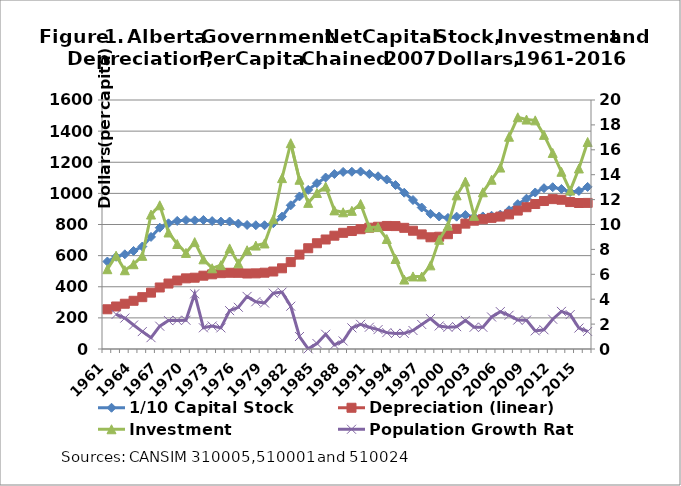
| Category | 1/10 Capital Stock | Depreciation (linear) | Investment |
|---|---|---|---|
| 1961.0 | 562.087 | 255.255 | 512.763 |
| 1962.0 | 592.476 | 273.192 | 599.708 |
| 1963.0 | 608.482 | 290.805 | 506.058 |
| 1964.0 | 630 | 309.79 | 544.755 |
| 1965.0 | 658.345 | 333.103 | 598.621 |
| 1966.0 | 720.202 | 362.22 | 863.86 |
| 1967.0 | 779.329 | 395.302 | 923.49 |
| 1968.0 | 807.546 | 420.604 | 748.688 |
| 1969.0 | 822.899 | 440.026 | 674.792 |
| 1970.0 | 828.527 | 453.918 | 617.555 |
| 1971.0 | 826.311 | 458.061 | 686.791 |
| 1972.0 | 828.941 | 471.049 | 576.121 |
| 1973.0 | 821.931 | 479.909 | 518.742 |
| 1974.0 | 818.524 | 487.285 | 538.578 |
| 1975.0 | 819.102 | 489.858 | 646.324 |
| 1976.0 | 805.548 | 489.491 | 550.477 |
| 1977.0 | 796.812 | 485.047 | 634.411 |
| 1978.0 | 795.306 | 486.094 | 664.609 |
| 1979.0 | 795.149 | 490.232 | 678.123 |
| 1980.0 | 807.977 | 497.94 | 833.855 |
| 1981.0 | 850.507 | 518.527 | 1098.161 |
| 1982.0 | 923.401 | 558.269 | 1322.459 |
| 1983.0 | 980.203 | 606.621 | 1087.489 |
| 1984.0 | 1022.471 | 647.477 | 939.051 |
| 1985.0 | 1065.34 | 679.562 | 1002.707 |
| 1986.0 | 1101.881 | 703.678 | 1043.598 |
| 1987.0 | 1124.309 | 728.017 | 890.663 |
| 1988.0 | 1137.948 | 746.556 | 878.445 |
| 1989.0 | 1138.923 | 758.108 | 887.795 |
| 1990.0 | 1140.087 | 769.687 | 932.181 |
| 1991.0 | 1124.019 | 779.615 | 780.772 |
| 1992.0 | 1109.785 | 785.514 | 783.235 |
| 1993.0 | 1088.82 | 790.69 | 706.709 |
| 1994.0 | 1053.578 | 789.823 | 578.389 |
| 1995.0 | 1004.272 | 778.565 | 446.148 |
| 1996.0 | 957.287 | 759.964 | 466.284 |
| 1997.0 | 909.13 | 736.435 | 465.749 |
| 1998.0 | 868.452 | 717.817 | 537.414 |
| 1999.0 | 851.596 | 721.376 | 701.733 |
| 2000.0 | 842.355 | 737.634 | 792.225 |
| 2001.0 | 850.402 | 772.052 | 987.219 |
| 2002.0 | 860.606 | 805.559 | 1075.997 |
| 2003.0 | 848.861 | 824.418 | 855.836 |
| 2004.0 | 851.875 | 833.748 | 1006.983 |
| 2005.0 | 856.174 | 842.657 | 1087.716 |
| 2006.0 | 863.545 | 850.831 | 1165.91 |
| 2007.0 | 891.341 | 864.819 | 1363.961 |
| 2008.0 | 930.764 | 889.382 | 1488.978 |
| 2009.0 | 965.782 | 911.094 | 1474.277 |
| 2010.0 | 1005.633 | 931.529 | 1469.228 |
| 2011.0 | 1033.325 | 950.876 | 1375.92 |
| 2012.0 | 1039.566 | 962.957 | 1259.806 |
| 2013.0 | 1028.252 | 958.991 | 1138.834 |
| 2014.0 | 1009.002 | 944.16 | 1017.911 |
| 2015.0 | 1015.673 | 938.115 | 1160.016 |
| 2016.0 | 1041.527 | 938.774 | 1330.382 |